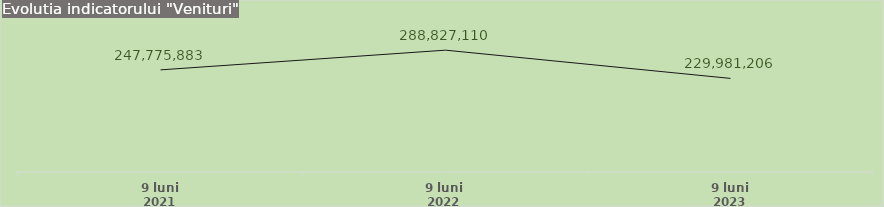
| Category | Series 1 |
|---|---|
| 9 luni 2021 | 247775883 |
| 9 luni 2022 | 288827110 |
| 9 luni 2023 | 229981206 |